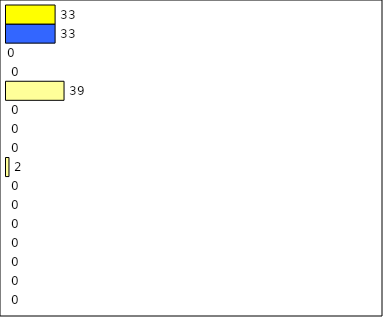
| Category | -2 | -1 | 0 | 1 | 2 | 3 | 4 | 5 | 6 | 7 | 8 | 9 | 10 | 11 | 12 | Perfect Round |
|---|---|---|---|---|---|---|---|---|---|---|---|---|---|---|---|---|
| 0 | 0 | 0 | 0 | 0 | 0 | 0 | 0 | 2 | 0 | 0 | 0 | 39 | 0 | 0 | 33 | 33 |